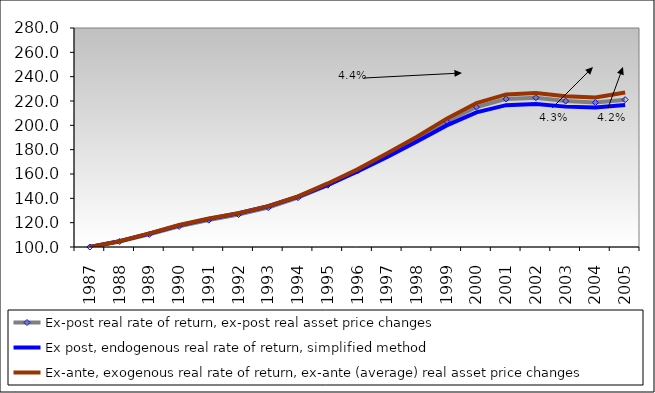
| Category | Ex-post real rate of return, ex-post real asset price changes | Ex post, endogenous real rate of return, simplified method | Ex-ante, exogenous real rate of return, ex-ante (average) real asset price changes |
|---|---|---|---|
| 1987.0 | 100 | 100 | 100 |
| 1988.0 | 104.533 | 104.823 | 104.738 |
| 1989.0 | 110.388 | 110.986 | 111.184 |
| 1990.0 | 116.924 | 117.8 | 118.064 |
| 1991.0 | 122.077 | 123.136 | 123.361 |
| 1992.0 | 126.676 | 127.773 | 127.821 |
| 1993.0 | 132.36 | 133.48 | 133.607 |
| 1994.0 | 140.56 | 141.445 | 141.675 |
| 1995.0 | 150.759 | 151.103 | 152.233 |
| 1996.0 | 162.538 | 162.151 | 163.796 |
| 1997.0 | 175.258 | 174.021 | 176.969 |
| 1998.0 | 188.648 | 186.655 | 190.595 |
| 1999.0 | 203.147 | 199.957 | 205.504 |
| 2000.0 | 215.038 | 210.671 | 218.274 |
| 2001.0 | 221.693 | 216.599 | 225.407 |
| 2002.0 | 222.698 | 217.547 | 226.604 |
| 2003.0 | 219.926 | 215.376 | 223.98 |
| 2004.0 | 218.707 | 214.601 | 222.801 |
| 2005.0 | 221.106 | 216.69 | 226.916 |